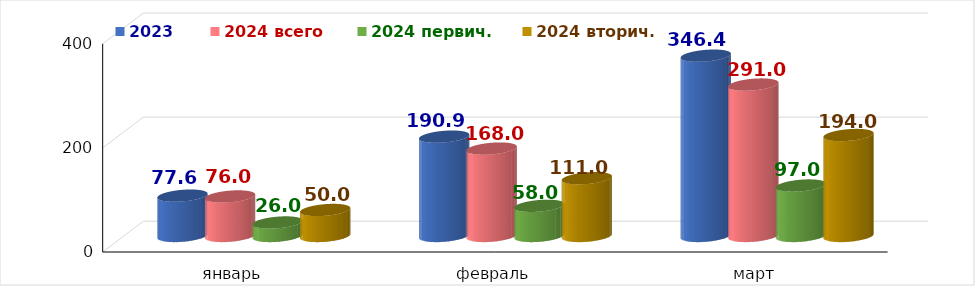
| Category | 2023 | 2024 всего | 2024 первич. | 2024 вторич. |
|---|---|---|---|---|
| январь | 77.551 | 76 | 26 | 50 |
| февраль | 190.909 | 168 | 58 | 111 |
| март | 346.429 | 291 | 97 | 194 |